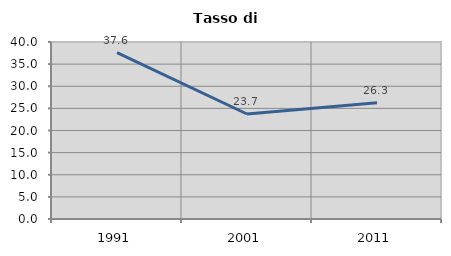
| Category | Tasso di disoccupazione   |
|---|---|
| 1991.0 | 37.604 |
| 2001.0 | 23.729 |
| 2011.0 | 26.271 |